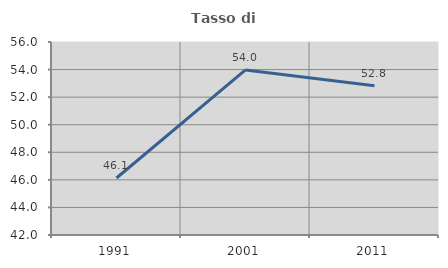
| Category | Tasso di occupazione   |
|---|---|
| 1991.0 | 46.135 |
| 2001.0 | 53.971 |
| 2011.0 | 52.828 |